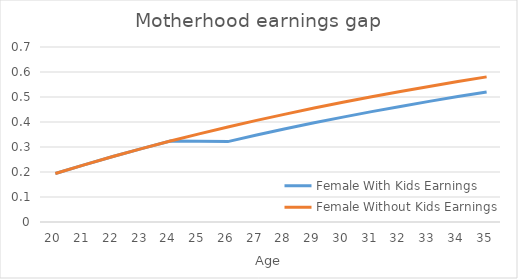
| Category | Female With Kids Earnings | Female Without Kids Earnings |
|---|---|---|
| 20.0 | 0.194 | 0.194 |
| 21.0 | 0.229 | 0.229 |
| 22.0 | 0.262 | 0.262 |
| 23.0 | 0.294 | 0.294 |
| 24.0 | 0.324 | 0.324 |
| 25.0 | 0.323 | 0.353 |
| 26.0 | 0.322 | 0.38 |
| 27.0 | 0.348 | 0.406 |
| 28.0 | 0.373 | 0.432 |
| 29.0 | 0.397 | 0.456 |
| 30.0 | 0.42 | 0.479 |
| 31.0 | 0.441 | 0.501 |
| 32.0 | 0.462 | 0.522 |
| 33.0 | 0.482 | 0.542 |
| 34.0 | 0.502 | 0.562 |
| 35.0 | 0.52 | 0.581 |